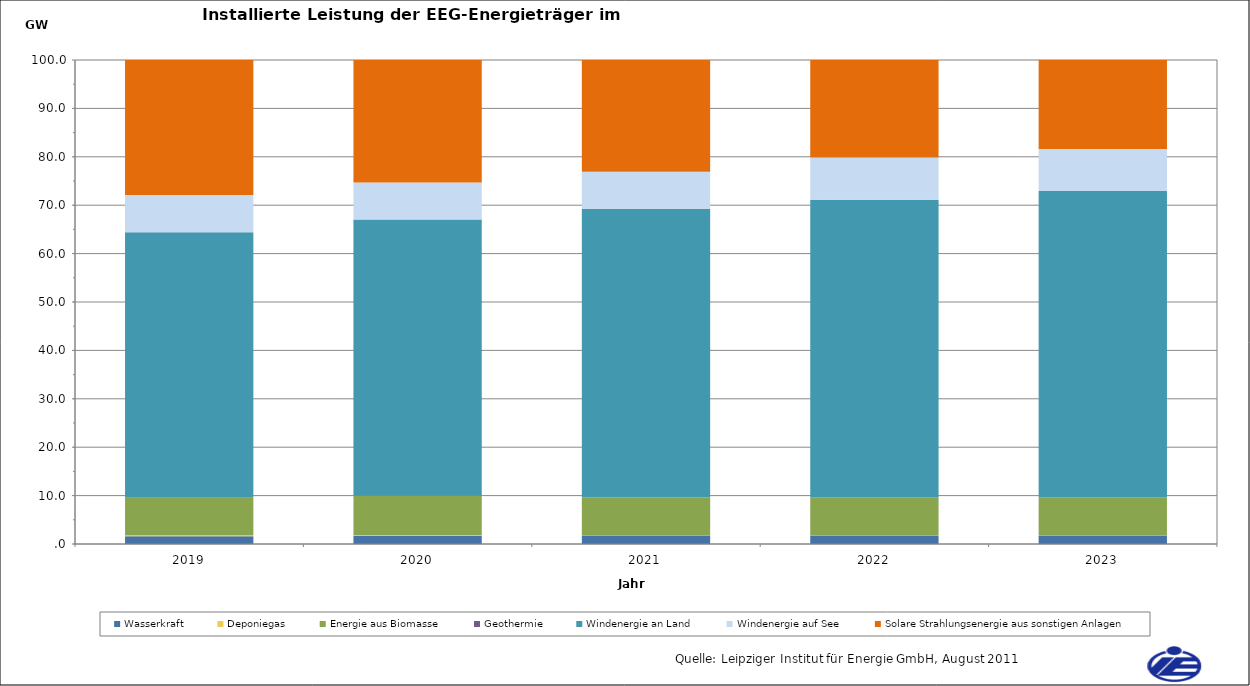
| Category | Wasserkraft | Deponiegas | Energie aus Biomasse | Geothermie | Windenergie an Land | Windenergie auf See | Solare Strahlungsenergie aus sonstigen Anlagen |
|---|---|---|---|---|---|---|---|
| 2019 | 1617.52 | 172.56 | 7875 | 47.21 | 54711.79 | 7659 | 34151.29 |
| 2020 | 1629.11 | 171.52 | 8149.14 | 51.11 | 57038.59 | 7659 | 35970.98 |
| 2021 | 1640.7 | 77.08 | 7899.28 | 55.02 | 59570.29 | 7659 | 37837.86 |
| 2022 | 1652.29 | 55.43 | 7838.37 | 58.92 | 61532.46 | 8716.9 | 38876.01 |
| 2023 | 1663.88 | 52.31 | 7837.91 | 62.82 | 63302 | 8716.9 | 39908.02 |